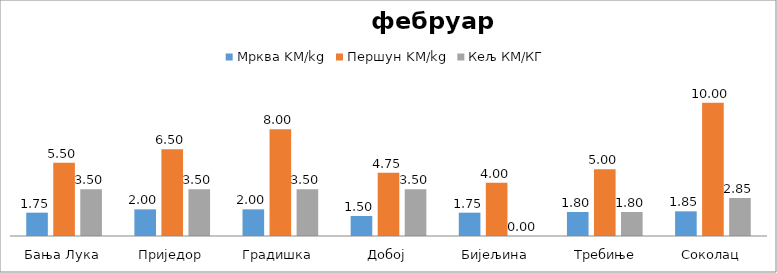
| Category | Мрква KM/kg | Першун KM/kg | Кељ КМ/КГ |
|---|---|---|---|
| Бања Лука | 1.75 | 5.5 | 3.5 |
| Приједор | 2 | 6.5 | 3.5 |
| Градишка | 2 | 8 | 3.5 |
| Добој | 1.5 | 4.75 | 3.5 |
| Бијељина | 1.75 | 4 | 0 |
|  Требиње | 1.8 | 5 | 1.8 |
| Соколац | 1.85 | 10 | 2.85 |